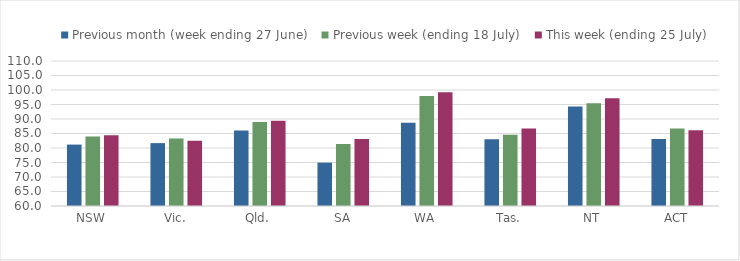
| Category | Previous month (week ending 27 June) | Previous week (ending 18 July) | This week (ending 25 July) |
|---|---|---|---|
| NSW | 81.177 | 83.927 | 84.416 |
| Vic. | 81.682 | 83.272 | 82.495 |
| Qld. | 86.024 | 88.969 | 89.431 |
| SA | 74.952 | 81.373 | 83.065 |
| WA | 88.677 | 97.942 | 99.225 |
| Tas. | 82.999 | 84.605 | 86.707 |
| NT | 94.336 | 95.469 | 97.168 |
| ACT | 83.117 | 86.753 | 86.104 |